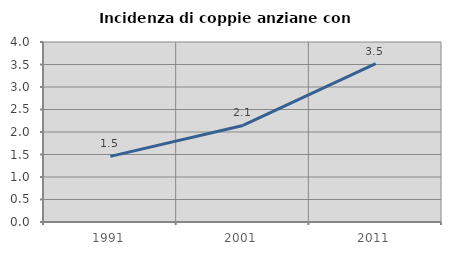
| Category | Incidenza di coppie anziane con figli |
|---|---|
| 1991.0 | 1.459 |
| 2001.0 | 2.145 |
| 2011.0 | 3.521 |